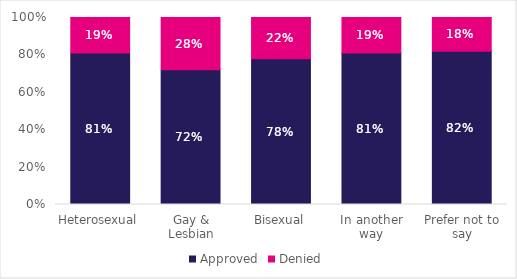
| Category | Approved | Denied |
|---|---|---|
| Heterosexual | 0.81 | 0.19 |
| Gay & Lesbian | 0.72 | 0.28 |
| Bisexual | 0.78 | 0.22 |
| In another way | 0.81 | 0.19 |
| Prefer not to say | 0.82 | 0.18 |